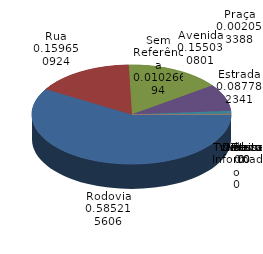
| Category | Qtde Acidentes |
|---|---|
| Rodovia | 1140 |
| Rua | 311 |
| Avenida | 302 |
| Estrada | 171 |
| Sem Referência | 20 |
| Praça | 4 |
| Beco | 0 |
| Distrito | 0 |
| Não Informado | 0 |
| Praca | 0 |
| Travessa | 0 |
| Viaduto | 0 |